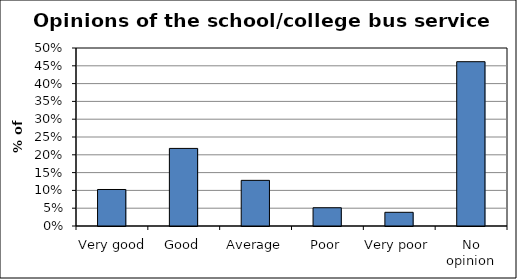
| Category | Series 0 |
|---|---|
| Very good | 0.103 |
| Good | 0.218 |
| Average | 0.128 |
| Poor | 0.051 |
| Very poor | 0.038 |
| No opinion | 0.462 |